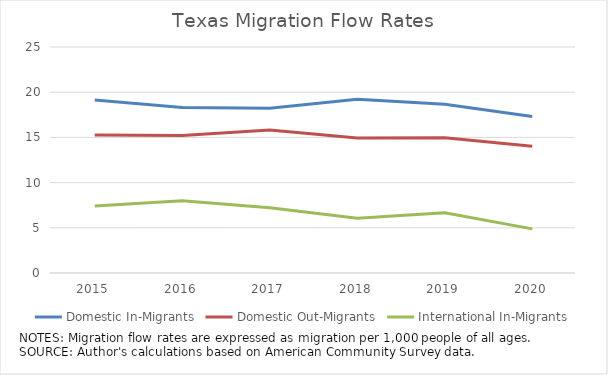
| Category | Domestic In-Migrants | Domestic Out-Migrants | International In-Migrants |
|---|---|---|---|
| 2015 | 19.124 | 15.264 | 7.418 |
| 2016 | 18.307 | 15.201 | 7.98 |
| 2017 | 18.234 | 15.819 | 7.21 |
| 2018 | 19.226 | 14.931 | 6.055 |
| 2019 | 18.671 | 14.963 | 6.675 |
| 2020 | 17.302 | 14.025 | 4.883 |